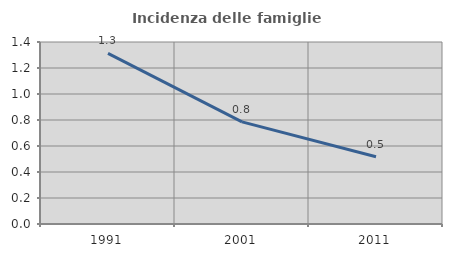
| Category | Incidenza delle famiglie numerose |
|---|---|
| 1991.0 | 1.312 |
| 2001.0 | 0.785 |
| 2011.0 | 0.517 |